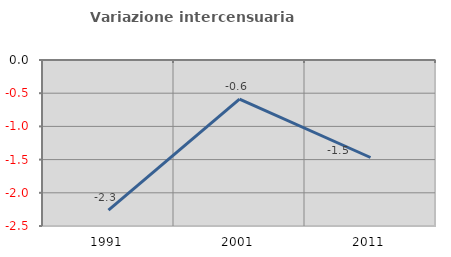
| Category | Variazione intercensuaria annua |
|---|---|
| 1991.0 | -2.26 |
| 2001.0 | -0.59 |
| 2011.0 | -1.468 |